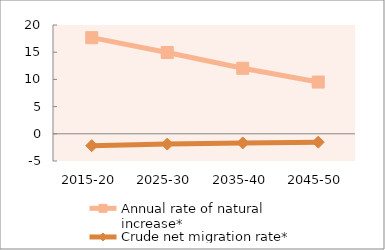
| Category | Annual rate of natural increase* | Crude net migration rate* |
|---|---|---|
| 2015-20 | 17.675 | -2.18 |
| 2025-30 | 14.946 | -1.889 |
| 2035-40 | 12.046 | -1.681 |
| 2045-50 | 9.513 | -1.534 |